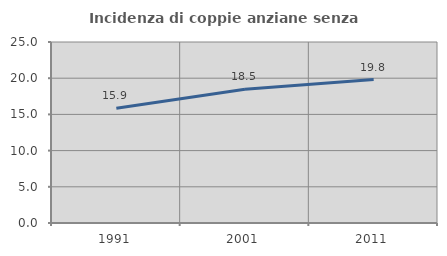
| Category | Incidenza di coppie anziane senza figli  |
|---|---|
| 1991.0 | 15.854 |
| 2001.0 | 18.478 |
| 2011.0 | 19.811 |